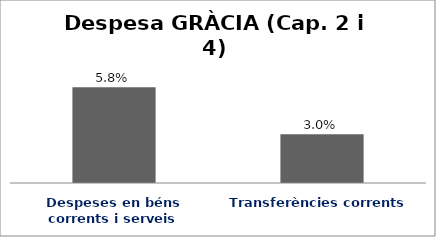
| Category | Series 0 |
|---|---|
| Despeses en béns corrents i serveis | 0.058 |
| Transferències corrents | 0.03 |